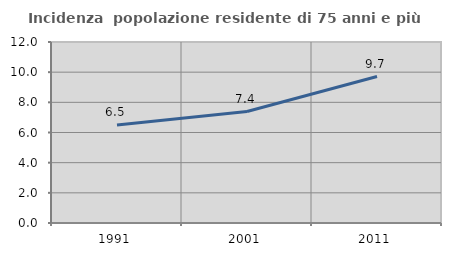
| Category | Incidenza  popolazione residente di 75 anni e più |
|---|---|
| 1991.0 | 6.499 |
| 2001.0 | 7.388 |
| 2011.0 | 9.709 |